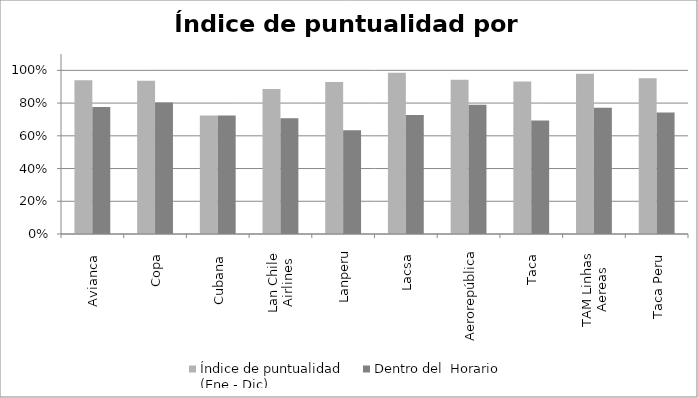
| Category | Índice de puntualidad
(Ene - Dic) | Dentro del  Horario |
|---|---|---|
| Avianca  | 0.94 | 0.777 |
| Copa  | 0.937 | 0.803 |
| Cubana  | 0.724 | 0.724 |
| Lan Chile
Airlines | 0.886 | 0.707 |
| Lanperu | 0.929 | 0.634 |
| Lacsa  | 0.985 | 0.727 |
| Aerorepública | 0.942 | 0.79 |
| Taca  | 0.932 | 0.694 |
| TAM Linhas
Aereas | 0.98 | 0.771 |
| Taca Peru  | 0.952 | 0.743 |